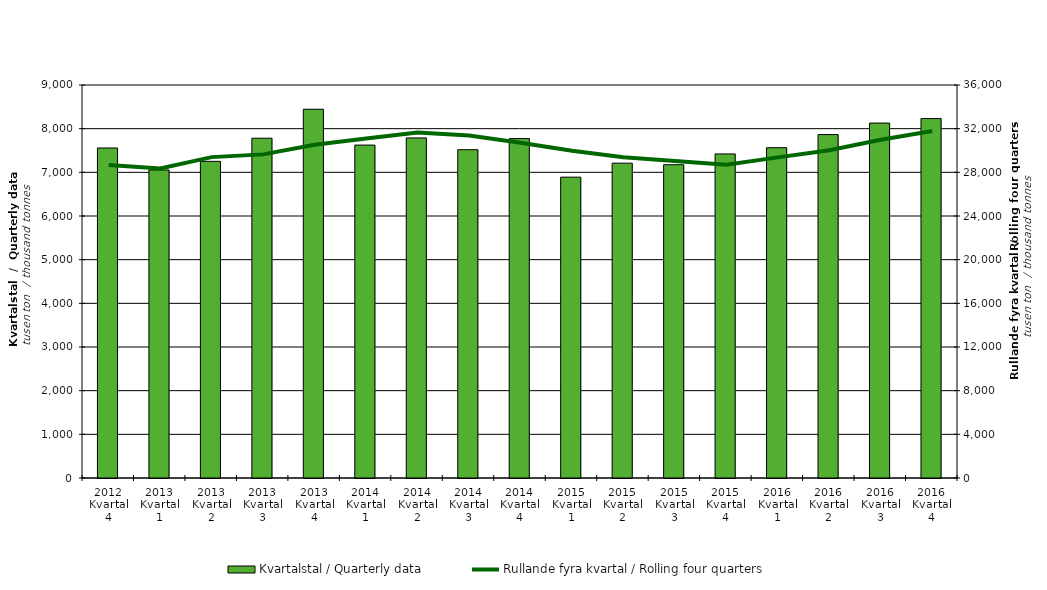
| Category | Kvartalstal / Quarterly data |
|---|---|
| 2012 Kvartal 4 | 7557.362 |
| 2013 Kvartal 1 | 7054.944 |
| 2013 Kvartal 2 | 7251.93 |
| 2013 Kvartal 3 | 7780.997 |
| 2013 Kvartal 4 | 8444.775 |
| 2014 Kvartal 1 | 7623.846 |
| 2014 Kvartal 2 | 7787.927 |
| 2014 Kvartal 3 | 7518.579 |
| 2014 Kvartal 4 | 7773.245 |
| 2015 Kvartal 1 | 6889.384 |
| 2015 Kvartal 2 | 7210.115 |
| 2015 Kvartal 3 | 7174.854 |
| 2015 Kvartal 4 | 7421.56 |
| 2016 Kvartal 1 | 7564.563 |
| 2016 Kvartal 2 | 7865.252 |
| 2016 Kvartal 3 | 8128.008 |
| 2016 Kvartal 4 | 8231.345 |